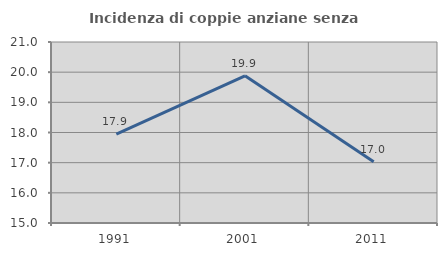
| Category | Incidenza di coppie anziane senza figli  |
|---|---|
| 1991.0 | 17.947 |
| 2001.0 | 19.877 |
| 2011.0 | 17.033 |